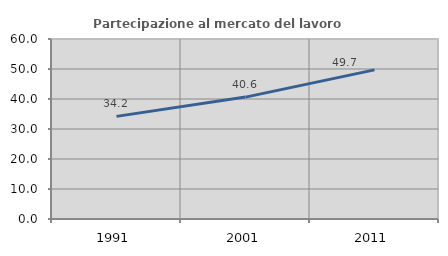
| Category | Partecipazione al mercato del lavoro  femminile |
|---|---|
| 1991.0 | 34.213 |
| 2001.0 | 40.634 |
| 2011.0 | 49.718 |